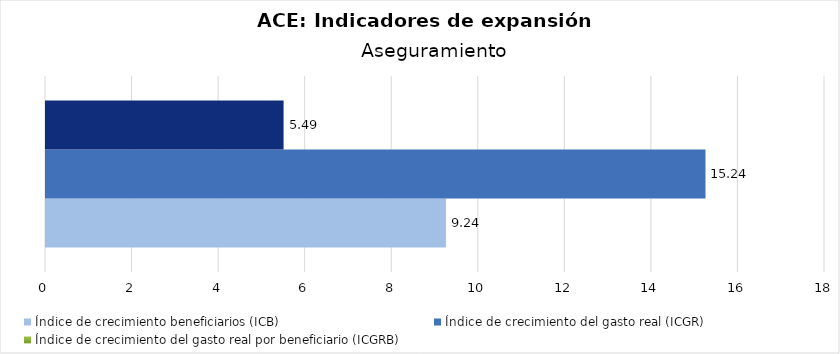
| Category | Índice de crecimiento beneficiarios (ICB)  | Índice de crecimiento del gasto real (ICGR)  | Índice de crecimiento del gasto real por beneficiario (ICGRB)  |
|---|---|---|---|
| Aseguramiento | 9.241 | 15.239 | 5.49 |